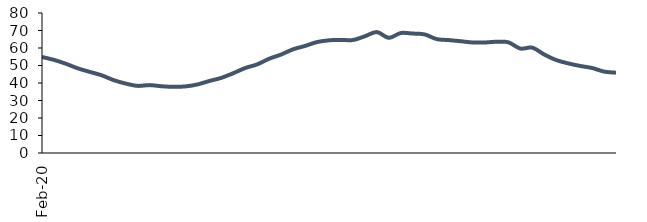
| Category | Series 0 |
|---|---|
| 2020-02-01 | 54.873 |
| 2020-03-01 | 53.212 |
| 2020-04-01 | 50.982 |
| 2020-05-01 | 48.355 |
| 2020-06-01 | 46.331 |
| 2020-07-01 | 44.38 |
| 2020-08-01 | 41.619 |
| 2020-09-01 | 39.667 |
| 2020-10-01 | 38.362 |
| 2020-11-01 | 38.792 |
| 2020-12-01 | 38.145 |
| 2021-01-01 | 37.796 |
| 2021-02-01 | 38.055 |
| 2021-03-01 | 39.169 |
| 2021-04-01 | 41.169 |
| 2021-05-01 | 42.952 |
| 2021-06-01 | 45.61 |
| 2021-07-01 | 48.568 |
| 2021-08-01 | 50.651 |
| 2021-09-01 | 53.87 |
| 2021-10-01 | 56.277 |
| 2021-11-01 | 59.262 |
| 2021-12-01 | 61.182 |
| 2022-01-01 | 63.387 |
| 2022-02-01 | 64.392 |
| 2022-03-01 | 64.636 |
| 2022-04-01 | 64.553 |
| 2022-05-01 | 66.706 |
| 2022-06-01 | 69.09 |
| 2022-07-01 | 65.835 |
| 2022-08-01 | 68.552 |
| 2022-09-01 | 68.253 |
| 2022-10-01 | 67.758 |
| 2022-11-01 | 65.088 |
| 2022-12-01 | 64.531 |
| 2023-01-01 | 63.88 |
| 2023-02-01 | 63.159 |
| 2023-03-01 | 63.145 |
| 2023-04-01 | 63.558 |
| 2023-05-01 | 63.246 |
| 2023-06-01 | 59.697 |
| 2023-07-01 | 60.197 |
| 2023-08-01 | 56.277 |
| 2023-09-01 | 53.115 |
| 2023-10-01 | 51.209 |
| 2023-11-01 | 49.736 |
| 2023-12-01 | 48.573 |
| 2024-01-01 | 46.536 |
| 2024-02-01 | 45.884 |